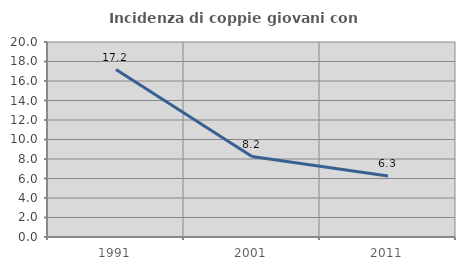
| Category | Incidenza di coppie giovani con figli |
|---|---|
| 1991.0 | 17.172 |
| 2001.0 | 8.247 |
| 2011.0 | 6.25 |